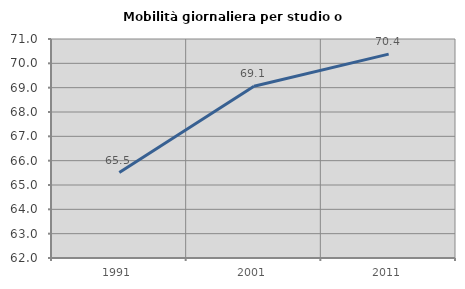
| Category | Mobilità giornaliera per studio o lavoro |
|---|---|
| 1991.0 | 65.51 |
| 2001.0 | 69.058 |
| 2011.0 | 70.38 |